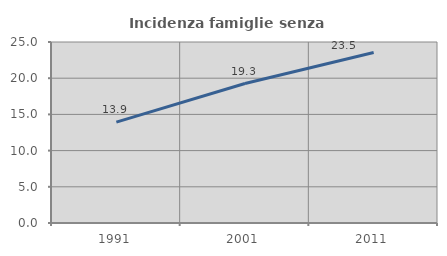
| Category | Incidenza famiglie senza nuclei |
|---|---|
| 1991.0 | 13.928 |
| 2001.0 | 19.26 |
| 2011.0 | 23.543 |